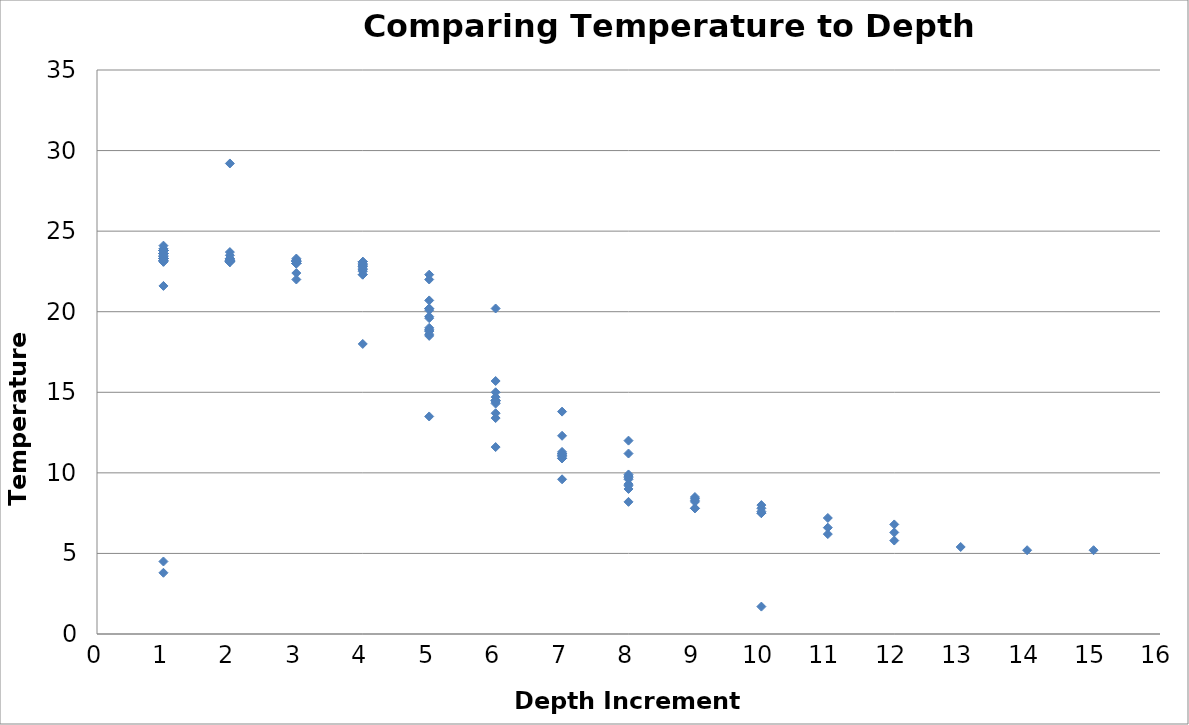
| Category | Temperature (Celsius) |
|---|---|
| 1.0 | 23.8 |
| 1.0 | 23.8 |
| 1.0 | 23.9 |
| 1.0 | 23.9 |
| 1.0 | 24.1 |
| 1.0 | 23.2 |
| 2.0 | 23.1 |
| 3.0 | 23.1 |
| 4.0 | 22.9 |
| 5.0 | 22.3 |
| 1.0 | 23.2 |
| 2.0 | 23.1 |
| 3.0 | 23.1 |
| 4.0 | 23.1 |
| 5.0 | 22 |
| 6.0 | 20.2 |
| 7.0 | 13.8 |
| 8.0 | 12 |
| 1.0 | 23.2 |
| 2.0 | 23.2 |
| 3.0 | 23.1 |
| 4.0 | 23.1 |
| 1.0 | 23.3 |
| 2.0 | 23.3 |
| 3.0 | 23.2 |
| 4.0 | 22.7 |
| 5.0 | 20.7 |
| 6.0 | 15.7 |
| 7.0 | 12.3 |
| 8.0 | 11.2 |
| 1.0 | 23.3 |
| 2.0 | 23.1 |
| 3.0 | 22.4 |
| 4.0 | 18 |
| 5.0 | 13.5 |
| 6.0 | 11.6 |
| 7.0 | 9.6 |
| 8.0 | 8.2 |
| 9.0 | 8.4 |
| 10.0 | 8 |
| 1.0 | 23.4 |
| 1.0 | 23.2 |
| 2.0 | 23.1 |
| 1.0 | 23.1 |
| 1.0 | 23.5 |
| 1.0 | 23.3 |
| 2.0 | 23.2 |
| 3.0 | 23.2 |
| 4.0 | 22.8 |
| 5.0 | 20.2 |
| 1.0 | 23.3 |
| 2.0 | 23.2 |
| 3.0 | 23.1 |
| 4.0 | 22.6 |
| 5.0 | 20.2 |
| 6.0 | 14.4 |
| 7.0 | 11.3 |
| 8.0 | 9.8 |
| 1.0 | 23.3 |
| 2.0 | 29.2 |
| 3.0 | 23.2 |
| 4.0 | 23.1 |
| 5.0 | 19 |
| 6.0 | 15 |
| 7.0 | 11.2 |
| 8.0 | 9.2 |
| 9.0 | 8.2 |
| 10.0 | 7.5 |
| 11.0 | 7.2 |
| 12.0 | 6.8 |
| 1.0 | 23.3 |
| 2.0 | 23.2 |
| 3.0 | 23 |
| 4.0 | 23 |
| 5.0 | 19.7 |
| 6.0 | 14.5 |
| 1.0 | 23.2 |
| 2.0 | 23.1 |
| 3.0 | 22 |
| 4.0 | 22.9 |
| 5.0 | 18.9 |
| 6.0 | 14.3 |
| 7.0 | 11.1 |
| 8.0 | 9.8 |
| 1.0 | 23.2 |
| 2.0 | 23.2 |
| 3.0 | 23 |
| 4.0 | 22.9 |
| 5.0 | 18.6 |
| 6.0 | 14.5 |
| 7.0 | 10.9 |
| 8.0 | 9.3 |
| 9.0 | 7.8 |
| 10.0 | 7.8 |
| 1.0 | 23.6 |
| 1.0 | 23.1 |
| 1.0 | 23.3 |
| 1.0 | 23.6 |
| 2.0 | 23.1 |
| 1.0 | 23.6 |
| 1.0 | 23.3 |
| 2.0 | 23.1 |
| 3.0 | 23 |
| 4.0 | 22.6 |
| 5.0 | 19.6 |
| 6.0 | 14.7 |
| 7.0 | 11 |
| 8.0 | 9 |
| 9.0 | 7.8 |
| 10.0 | 7.6 |
| 1.0 | 23.8 |
| 1.0 | 23.8 |
| 1.0 | 23.8 |
| 2.0 | 23.5 |
| 3.0 | 23 |
| 4.0 | 22.3 |
| 5.0 | 20.1 |
| 1.0 | 23.6 |
| 1.0 | 23.8 |
| 1.0 | 23.8 |
| 1.0 | 23.8 |
| 2.0 | 23.7 |
| 3.0 | 23.3 |
| 1.0 | 23.8 |
| 1.0 | 23.8 |
| 1.0 | 23.8 |
| 1.0 | 23.8 |
| 1.0 | 23.8 |
| 1.0 | 23.6 |
| 2.0 | 23.2 |
| 3.0 | 23 |
| 4.0 | 22.3 |
| 5.0 | 18.8 |
| 6.0 | 13.4 |
| 7.0 | 11.1 |
| 8.0 | 9.9 |
| 1.0 | 23.4 |
| 2.0 | 23.1 |
| 3.0 | 23.1 |
| 4.0 | 22.5 |
| 5.0 | 18.8 |
| 6.0 | 13.7 |
| 7.0 | 10.9 |
| 8.0 | 9.6 |
| 9.0 | 8.5 |
| 10.0 | 7.5 |
| 11.0 | 6.6 |
| 12.0 | 6.3 |
| 1.0 | 4.5 |
| 1.0 | 23.6 |
| 2.0 | 23.3 |
| 3.0 | 23.2 |
| 4.0 | 22.8 |
| 5.0 | 18.5 |
| 6.0 | 14.5 |
| 7.0 | 11.2 |
| 8.0 | 9.7 |
| 9.0 | 8.3 |
| 10.0 | 1.7 |
| 11.0 | 6.2 |
| 12.0 | 5.8 |
| 13.0 | 5.4 |
| 14.0 | 5.2 |
| 15.0 | 5.2 |
| 1.0 | 23.4 |
| 1.0 | 3.8 |
| 1.0 | 23.4 |
| 1.0 | 21.6 |
| 1.0 | 23.4 |
| 1.0 | 23.4 |
| 1.0 | 23.4 |
| 1.0 | 23.6 |